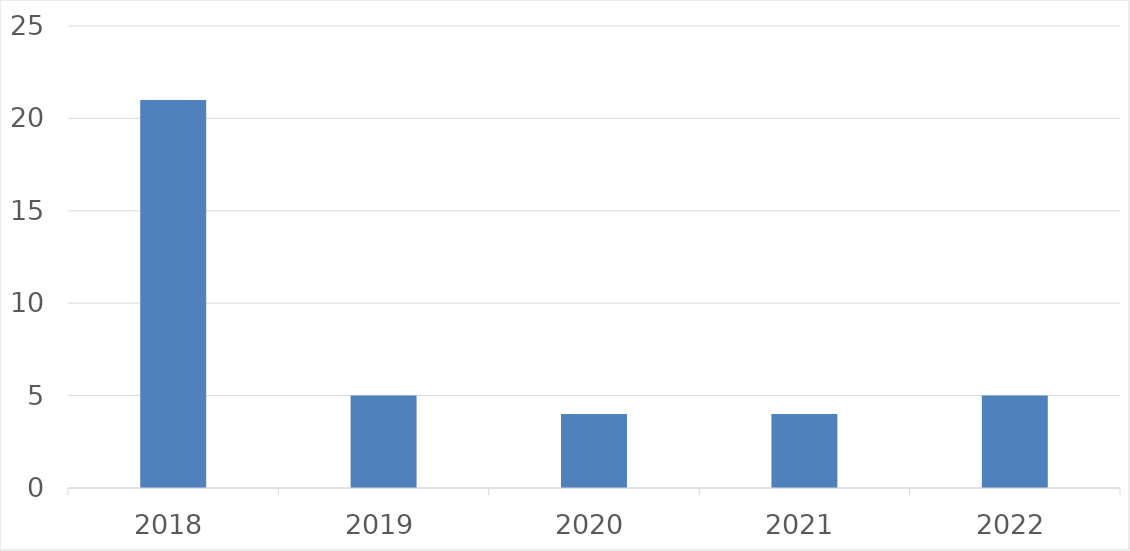
| Category | Series 0 |
|---|---|
| 2018 | 21 |
| 2019 | 5 |
| 2020 | 4 |
| 2021 | 4 |
| 2022 | 5 |